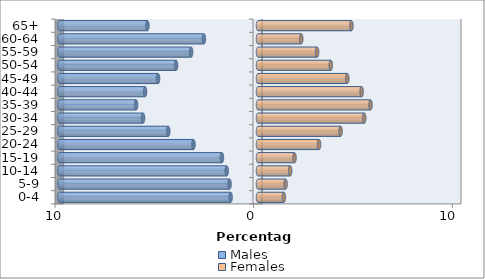
| Category | Males | Females |
|---|---|---|
| 0-4 | -1.378 | 1.301 |
| 5-9 | -1.433 | 1.389 |
| 10-14 | -1.575 | 1.619 |
| 15-19 | -1.815 | 1.837 |
| 20-24 | -3.248 | 3.073 |
| 25-29 | -4.517 | 4.156 |
| 30-34 | -5.785 | 5.348 |
| 35-39 | -6.135 | 5.665 |
| 40-44 | -5.687 | 5.217 |
| 45-49 | -5.031 | 4.495 |
| 50-54 | -4.123 | 3.664 |
| 55-59 | -3.368 | 2.975 |
| 60-64 | -2.723 | 2.176 |
| 65+ | -5.566 | 4.703 |